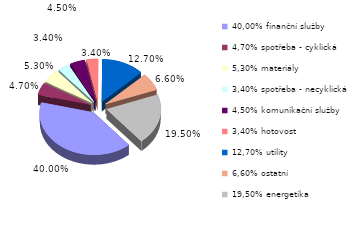
| Category | Series 0 |
|---|---|
| 40,00% finanční služby | 0.4 |
| 4,70% spotřeba - cyklická | 0.047 |
| 5,30% materiály | 0.053 |
| 3,40% spotřeba - necyklická | 0.034 |
| 4,50% komunikační služby | 0.045 |
| 3,40% hotovost | 0.034 |
| 12,70% utility | 0.127 |
| 6,60% ostatní | 0.066 |
| 19,50% energetika | 0.195 |